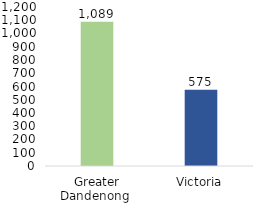
| Category | Series 0 |
|---|---|
| Greater Dandenong  | 1089.399 |
| Victoria | 575 |